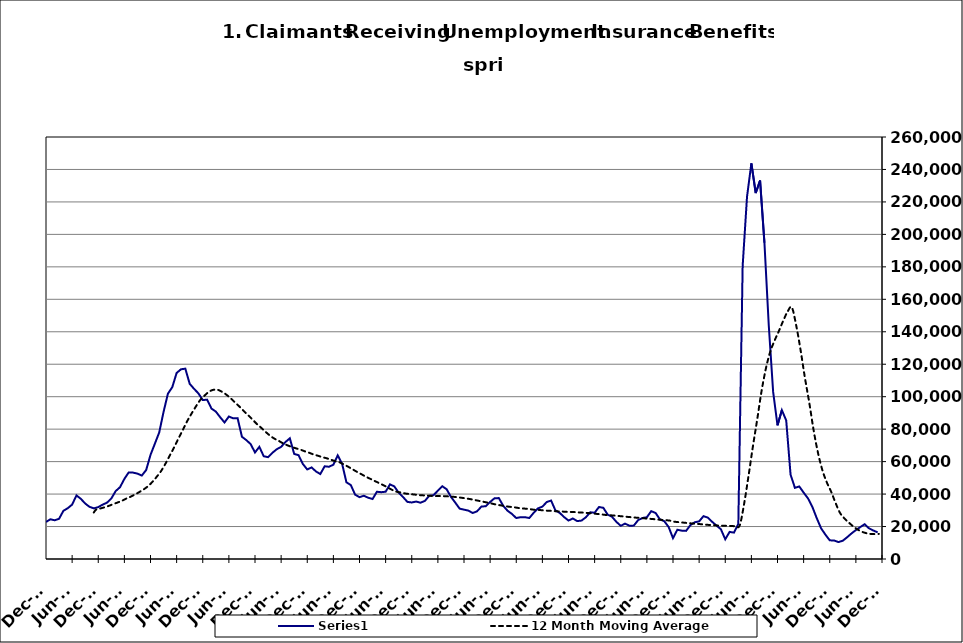
| Category | Series 0 |
|---|---|
| 2000-01-31 | 15239 |
| 2000-02-29 | 13995 |
| 2000-03-31 | 14536 |
| 2000-04-30 | 18337 |
| 2000-05-31 | 20863 |
| 2000-06-30 | 24310 |
| 2000-07-31 | 29359 |
| 2000-08-31 | 29764 |
| 2000-09-30 | 24540 |
| 2000-10-31 | 23067 |
| 2000-11-30 | 21129 |
| 2000-12-31 | 20288 |
| 2001-01-31 | 23646 |
| 2001-02-28 | 23782 |
| 2001-03-31 | 27047 |
| 2001-04-30 | 34048 |
| 2001-05-31 | 38168 |
| 2001-06-30 | 41894 |
| 2001-07-31 | 48114 |
| 2001-08-31 | 47646 |
| 2001-09-30 | 44132 |
| 2001-10-31 | 44465 |
| 2001-11-30 | 45928 |
| 2001-12-31 | 48930 |
| 2002-01-31 | 51864 |
| 2002-02-28 | 50778 |
| 2002-03-31 | 53014 |
| 2002-04-30 | 65394 |
| 2002-05-31 | 67925 |
| 2002-06-30 | 68727 |
| 2002-07-31 | 67269 |
| 2002-08-31 | 64233 |
| 2002-09-30 | 59955 |
| 2002-10-31 | 55535 |
| 2002-11-30 | 52233 |
| 2002-12-31 | 52252 |
| 2003-01-31 | 52694 |
| 2003-02-28 | 52578 |
| 2003-03-31 | 56236 |
| 2003-04-30 | 61020 |
| 2003-05-31 | 60584 |
| 2003-06-30 | 64980 |
| 2003-07-31 | 66426 |
| 2003-08-31 | 65403 |
| 2003-09-30 | 58348 |
| 2003-10-31 | 53953 |
| 2003-11-30 | 50453 |
| 2003-12-31 | 47799 |
| 2004-01-31 | 47134 |
| 2004-02-29 | 42441 |
| 2004-03-31 | 39363 |
| 2004-04-30 | 41157 |
| 2004-05-31 | 40892 |
| 2004-06-30 | 43601 |
| 2004-07-31 | 45411 |
| 2004-08-31 | 44738 |
| 2004-09-30 | 36049 |
| 2004-10-31 | 33551 |
| 2004-11-30 | 31386 |
| 2004-12-31 | 30195 |
| 2005-01-31 | 31661 |
| 2005-02-28 | 28205 |
| 2005-03-31 | 28194 |
| 2005-04-30 | 31233 |
| 2005-05-31 | 24184 |
| 2005-06-30 | 33525 |
| 2005-07-31 | 35776 |
| 2005-08-31 | 33297 |
| 2005-09-30 | 27423 |
| 2005-10-31 | 25647 |
| 2005-11-30 | 21039 |
| 2005-12-31 | 21238 |
| 2006-01-31 | 22270 |
| 2006-02-28 | 19689 |
| 2006-03-31 | 19474 |
| 2006-04-30 | 22420 |
| 2006-05-31 | 24146 |
| 2006-06-30 | 26450 |
| 2006-07-31 | 30575 |
| 2006-08-31 | 30038 |
| 2006-09-30 | 25657 |
| 2006-10-31 | 24869 |
| 2006-11-30 | 22832 |
| 2006-12-31 | 22826 |
| 2007-01-31 | 24459 |
| 2007-02-28 | 23856 |
| 2007-03-31 | 24786 |
| 2007-04-30 | 29690 |
| 2007-05-31 | 31303 |
| 2007-06-30 | 33512 |
| 2007-07-31 | 39176 |
| 2007-08-31 | 37077 |
| 2007-09-30 | 34179 |
| 2007-10-31 | 32130 |
| 2007-11-15 | 31205 |
| 2007-12-15 09:36:00 | 31973 |
| 2008-01-14 19:12:00 | 33494 |
| 2008-02-14 04:48:00 | 34694 |
| 2008-03-15 14:24:00 | 37279 |
| 2008-04-15 | 41840 |
| 2008-05-15 09:36:00 | 44245 |
| 2008-06-14 19:12:00 | 49341 |
| 2008-07-15 04:48:00 | 53353 |
| 2008-08-14 14:24:00 | 53222 |
| 2008-09-14 | 52594 |
| 2008-10-14 09:36:00 | 51417 |
| 2008-11-13 19:12:00 | 54795 |
| 2008-12-14 04:48:00 | 64139 |
| 2009-01-13 14:24:00 | 71026 |
| 2009-02-13 | 77947 |
| 2009-03-15 09:36:00 | 90649 |
| 2009-04-14 19:12:00 | 101865 |
| 2009-05-15 04:48:00 | 105867 |
| 2009-06-14 14:24:00 | 114626 |
| 2009-07-15 | 116882 |
| 2009-08-14 09:36:00 | 117270 |
| 2009-09-13 19:12:00 | 107943 |
| 2009-10-14 04:48:00 | 104849 |
| 2009-11-13 14:24:00 | 102065 |
| 2009-12-14 | 97917 |
| 2010-01-13 09:36:00 | 98175 |
| 2010-02-12 19:12:00 | 92691 |
| 2010-03-15 04:48:00 | 90832 |
| 2010-04-14 14:24:00 | 87347 |
| 2010-05-15 | 84120 |
| 2010-06-14 09:36:00 | 87787 |
| 2010-07-14 19:12:00 | 86654 |
| 2010-08-14 04:48:00 | 86789 |
| 2010-09-13 14:24:00 | 75317 |
| 2010-10-14 | 73259 |
| 2010-11-13 09:36:00 | 70783 |
| 2010-12-13 19:12:00 | 65644 |
| 2011-01-13 04:48:00 | 69106 |
| 2011-02-12 14:24:00 | 63322 |
| 2011-03-15 | 62724 |
| 2011-04-14 09:36:00 | 65434 |
| 2011-05-14 19:12:00 | 67641 |
| 2011-06-14 04:48:00 | 69087 |
| 2011-07-14 14:24:00 | 72082 |
| 2011-08-14 | 74376 |
| 2011-09-13 09:36:00 | 64739 |
| 2011-10-13 19:12:00 | 63965 |
| 2011-11-13 04:48:00 | 58496 |
| 2011-12-13 14:24:00 | 55173 |
| 2012-01-13 | 56418 |
| 2012-02-12 09:36:00 | 53942 |
| 2012-03-13 19:12:00 | 52352 |
| 2012-04-13 04:48:00 | 57118 |
| 2012-05-13 14:24:00 | 56827 |
| 2012-06-13 | 58115 |
| 2012-07-13 09:36:00 | 63863 |
| 2012-08-12 19:12:00 | 58706 |
| 2012-09-12 04:48:00 | 47243 |
| 2012-10-12 14:24:00 | 45567 |
| 2012-11-12 | 39623 |
| 2012-12-12 09:36:00 | 38101 |
| 2013-01-11 19:12:00 | 38966 |
| 2013-02-11 04:48:00 | 37746 |
| 2013-03-13 14:24:00 | 36956 |
| 2013-04-13 | 41439 |
| 2013-05-13 09:36:00 | 41162 |
| 2013-06-12 19:12:00 | 41455 |
| 2013-07-13 04:48:00 | 45989 |
| 2013-08-12 14:24:00 | 44712 |
| 2013-09-12 | 40828 |
| 2013-10-12 09:36:00 | 38185 |
| 2013-11-11 19:12:00 | 35184 |
| 2013-12-12 04:48:00 | 34824 |
| 2014-01-11 14:24:00 | 35396 |
| 2014-02-11 | 34683 |
| 2014-03-13 09:36:00 | 35748 |
| 2014-04-12 19:12:00 | 38892 |
| 2014-05-13 04:48:00 | 39325 |
| 2014-06-12 14:24:00 | 42091 |
| 2014-07-13 | 44842 |
| 2014-08-14 | 43016 |
| 2014-09-13 09:36:00 | 38304 |
| 2014-10-13 19:12:00 | 34708 |
| 2014-11-13 04:48:00 | 31017 |
| 2014-12-13 14:24:00 | 30402 |
| 2015-01-13 | 29823 |
| 2015-02-12 09:36:00 | 28333 |
| 2015-03-14 19:12:00 | 29389 |
| 2015-04-14 04:48:00 | 32293 |
| 2015-05-14 14:24:00 | 32538 |
| 2015-06-14 | 35137 |
| 2015-07-14 09:36:00 | 37398 |
| 2015-08-13 19:12:00 | 37536 |
| 2015-09-13 04:48:00 | 32808 |
| 2015-10-13 14:24:00 | 29728 |
| 2015-11-13 | 27775 |
| 2015-12-13 09:36:00 | 25227 |
| 2016-01-12 19:12:00 | 25773 |
| 2016-02-12 04:48:00 | 25758 |
| 2016-03-13 14:24:00 | 25247 |
| 2016-04-13 | 28463 |
| 2016-05-13 09:36:00 | 31210 |
| 2016-06-12 19:12:00 | 32255 |
| 2016-07-13 04:48:00 | 35088 |
| 2016-08-12 14:24:00 | 36018 |
| 2016-09-12 | 29922 |
| 2016-10-12 09:36:00 | 28368 |
| 2016-11-11 19:12:00 | 25818 |
| 2016-12-12 04:48:00 | 23690 |
| 2017-01-11 14:24:00 | 24964 |
| 2017-02-11 | 23348 |
| 2017-03-13 09:36:00 | 23685 |
| 2017-04-12 19:12:00 | 25733 |
| 2017-05-13 04:48:00 | 28796 |
| 2017-06-12 14:24:00 | 28489 |
| 2017-07-13 | 32034 |
| 2017-08-12 09:36:00 | 31539 |
| 2017-09-11 19:12:00 | 27321 |
| 2017-10-12 04:48:00 | 25990 |
| 2017-11-11 14:24:00 | 22875 |
| 2017-12-12 | 20445 |
| 2018-01-11 09:36:00 | 21794 |
| 2018-02-10 19:12:00 | 20475 |
| 2018-03-13 04:48:00 | 20585 |
| 2018-04-12 14:24:00 | 23969 |
| 2018-05-13 | 25280 |
| 2018-06-12 09:36:00 | 25741 |
| 2018-07-12 19:12:00 | 29479 |
| 2018-08-12 04:48:00 | 28351 |
| 2018-09-11 14:24:00 | 24386 |
| 2018-10-12 | 23292 |
| 2018-11-11 09:36:00 | 19711 |
| 2018-12-11 19:12:00 | 12853 |
| 2019-01-11 04:48:00 | 18039 |
| 2019-02-10 14:24:00 | 17466 |
| 2019-03-13 | 17325 |
| 2019-04-12 09:36:00 | 20890 |
| 2019-05-12 19:12:00 | 22641 |
| 2019-06-12 04:48:00 | 23178 |
| 2019-07-12 14:24:00 | 26385 |
| 2019-08-12 | 25501 |
| 2019-09-11 09:36:00 | 22892 |
| 2019-10-11 19:12:00 | 20585 |
| 2019-11-11 04:48:00 | 18323 |
| 2019-12-11 14:24:00 | 12174 |
| 2020-01-11 | 16684 |
| 2020-02-10 09:36:00 | 16260 |
| 2020-03-11 19:12:00 | 21667 |
| 2020-04-11 04:48:00 | 180666 |
| 2020-05-11 14:24:00 | 223189 |
| 2020-06-11 | 243809 |
| 2020-07-11 09:36:00 | 225469 |
| 2020-08-10 19:12:00 | 233220 |
| 2020-09-10 04:48:00 | 194839 |
| 2020-10-10 14:24:00 | 143722 |
| 2020-11-10 | 102967 |
| 2020-12-10 09:36:00 | 82367 |
| 2021-01-09 19:12:00 | 91710 |
| 2021-02-09 04:48:00 | 85397 |
| 2021-03-11 14:24:00 | 51963 |
| 2021-04-11 | 43840 |
| 2021-05-11 09:36:00 | 44687 |
| 2021-06-10 19:12:00 | 40936 |
| 2021-07-11 04:48:00 | 37365 |
| 2021-08-10 14:24:00 | 32159 |
| 2021-09-10 | 25254 |
| 2021-10-10 09:36:00 | 18966 |
| 2021-11-09 19:12:00 | 14997 |
| 2021-12-10 04:48:00 | 11499 |
| 2022-01-09 14:24:00 | 11404 |
| 2022-02-09 | 10424 |
| 2022-03-11 09:36:00 | 11269 |
| 2022-04-10 19:12:00 | 13419 |
| 2022-05-11 04:48:00 | 15755 |
| 2022-06-10 14:24:00 | 17823 |
| 2022-07-11 | 19654 |
| 2022-08-10 09:36:00 | 21418 |
| 2022-09-09 19:12:00 | 18932 |
| 2022-10-10 04:48:00 | 17577 |
| 2022-11-09 14:24:00 | 16421 |
| 2022-12-10 | 10320 |